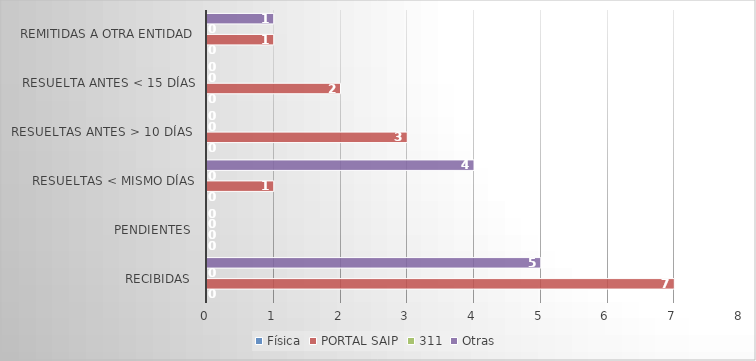
| Category | Física | PORTAL SAIP | 311 | Otras |
|---|---|---|---|---|
| Recibidas  | 0 | 7 | 0 | 5 |
| Pendientes  | 0 | 0 | 0 | 0 |
| Resueltas < mismo días | 0 | 1 | 0 | 4 |
| Resueltas antes > 10 días  | 0 | 3 | 0 | 0 |
| Resuelta antes < 15 días | 0 | 2 | 0 | 0 |
| Remitidas a otra entidad | 0 | 1 | 0 | 1 |